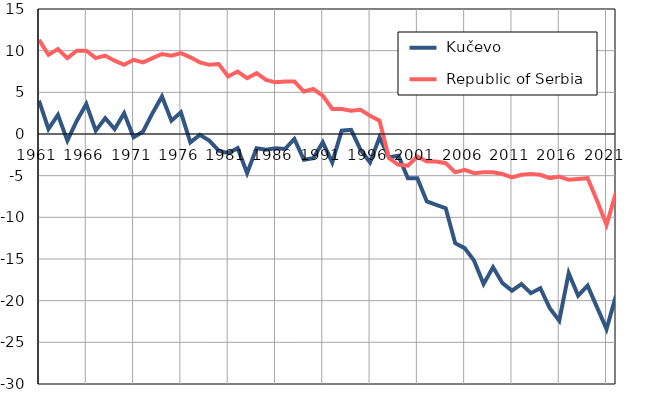
| Category |  Kučevo |  Republic of Serbia |
|---|---|---|
| 1961.0 | 4 | 11.3 |
| 1962.0 | 0.6 | 9.5 |
| 1963.0 | 2.3 | 10.2 |
| 1964.0 | -0.8 | 9.1 |
| 1965.0 | 1.6 | 10 |
| 1966.0 | 3.6 | 10 |
| 1967.0 | 0.4 | 9.1 |
| 1968.0 | 1.9 | 9.4 |
| 1969.0 | 0.6 | 8.8 |
| 1970.0 | 2.5 | 8.3 |
| 1971.0 | -0.4 | 8.9 |
| 1972.0 | 0.3 | 8.6 |
| 1973.0 | 2.5 | 9.1 |
| 1974.0 | 4.5 | 9.6 |
| 1975.0 | 1.6 | 9.4 |
| 1976.0 | 2.6 | 9.7 |
| 1977.0 | -1 | 9.2 |
| 1978.0 | -0.1 | 8.6 |
| 1979.0 | -0.8 | 8.3 |
| 1980.0 | -2 | 8.4 |
| 1981.0 | -2.3 | 6.9 |
| 1982.0 | -1.7 | 7.5 |
| 1983.0 | -4.7 | 6.7 |
| 1984.0 | -1.7 | 7.3 |
| 1985.0 | -1.9 | 6.5 |
| 1986.0 | -1.7 | 6.2 |
| 1987.0 | -1.8 | 6.3 |
| 1988.0 | -0.6 | 6.3 |
| 1989.0 | -3.1 | 5.1 |
| 1990.0 | -2.9 | 5.4 |
| 1991.0 | -1 | 4.6 |
| 1992.0 | -3.4 | 3 |
| 1993.0 | 0.4 | 3 |
| 1994.0 | 0.5 | 2.8 |
| 1995.0 | -1.9 | 2.9 |
| 1996.0 | -3.4 | 2.2 |
| 1997.0 | -0.4 | 1.6 |
| 1998.0 | -2.8 | -2.9 |
| 1999.0 | -2.6 | -3.7 |
| 2000.0 | -5.3 | -3.8 |
| 2001.0 | -5.3 | -2.7 |
| 2002.0 | -8.1 | -3.3 |
| 2003.0 | -8.5 | -3.3 |
| 2004.0 | -8.9 | -3.5 |
| 2005.0 | -13.1 | -4.6 |
| 2006.0 | -13.7 | -4.3 |
| 2007.0 | -15.2 | -4.7 |
| 2008.0 | -18 | -4.6 |
| 2009.0 | -16 | -4.6 |
| 2010.0 | -17.9 | -4.8 |
| 2011.0 | -18.8 | -5.2 |
| 2012.0 | -18 | -4.9 |
| 2013.0 | -19.1 | -4.8 |
| 2014.0 | -18.5 | -4.9 |
| 2015.0 | -20.9 | -5.3 |
| 2016.0 | -22.4 | -5.1 |
| 2017.0 | -16.7 | -5.5 |
| 2018.0 | -19.4 | -5.4 |
| 2019.0 | -18.2 | -5.3 |
| 2020.0 | -20.8 | -8 |
| 2021.0 | -23.4 | -10.9 |
| 2022.0 | -19.4 | -7 |